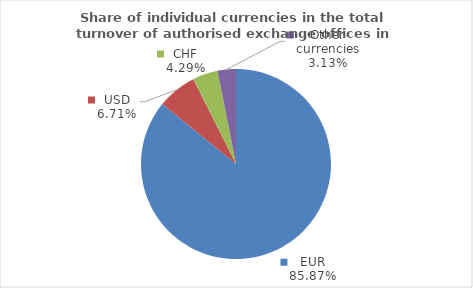
| Category | Series 0 |
|---|---|
| EUR | 85.873 |
| USD | 6.711 |
| CHF | 4.286 |
| Other currencies | 3.13 |